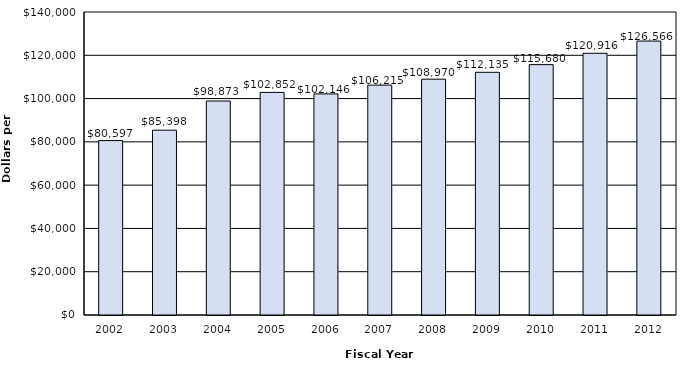
| Category | Total Revenue |
|---|---|
| 2002.0 | 80597 |
| 2003.0 | 85398 |
| 2004.0 | 98873 |
| 2005.0 | 102852 |
| 2006.0 | 102146 |
| 2007.0 | 106215 |
| 2008.0 | 108970 |
| 2009.0 | 112135 |
| 2010.0 | 115680 |
| 2011.0 | 120916 |
| 2012.0 | 126566 |